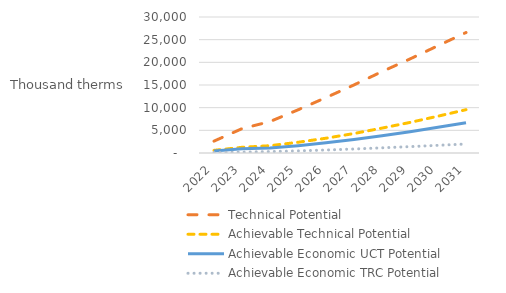
| Category | Technical Potential | Achievable Technical Potential | Achievable Economic UCT Potential | Achievable Economic TRC Potential |
|---|---|---|---|---|
| 2022.0 | 2620.365 | 582.678 | 429.213 | 91.094 |
| 2023.0 | 5370.501 | 1256.565 | 927.221 | 195.552 |
| 2024.0 | 6935.625 | 1612.955 | 1082.401 | 317.565 |
| 2025.0 | 9518.932 | 2365.261 | 1608.335 | 471.464 |
| 2026.0 | 12229.588 | 3262.236 | 2240.169 | 659.922 |
| 2027.0 | 15016.261 | 4297.707 | 2971.951 | 881.615 |
| 2028.0 | 17955.521 | 5491.162 | 3815.489 | 1138.195 |
| 2029.0 | 20744.151 | 6745.079 | 4699.72 | 1407.143 |
| 2030.0 | 23665.52 | 8121.148 | 5670.094 | 1694.801 |
| 2031.0 | 26572.835 | 9555.864 | 6681.489 | 1985.509 |